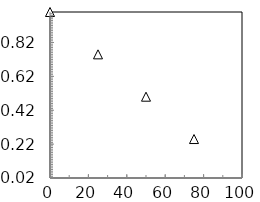
| Category | Series 2 |
|---|---|
| 0.0 | 1 |
| 25.0 | 0.75 |
| 50.0 | 0.5 |
| 75.0 | 0.25 |
| 100.0 | 0 |